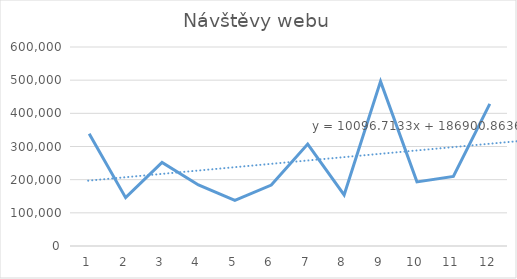
| Category | Návštěvy webu |
|---|---|
| 0 | 338508 |
| 1 | 145659 |
| 2 | 251868 |
| 3 | 184186 |
| 4 | 137741 |
| 5 | 183563 |
| 6 | 307291 |
| 7 | 153838 |
| 8 | 496323 |
| 9 | 193328 |
| 10 | 209642 |
| 11 | 428407 |